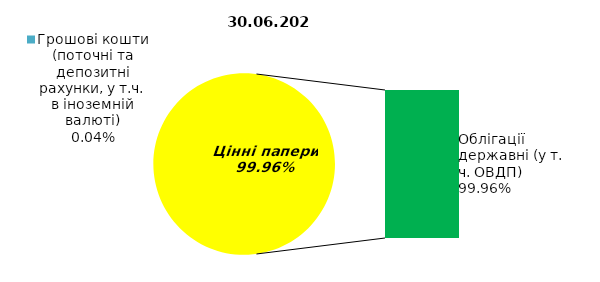
| Category | Series 0 |
|---|---|
| Грошові кошти (поточні та депозитні рахунки, у т.ч. в іноземній валюті) | 0.061 |
| Банківські метали | 0 |
| Нерухомість | 0 |
| Інші активи | 0 |
| Акції | 0 |
| Корпоративні облігації  | 0 |
| Облігації місцевих позик | 0 |
| Облігації державні (у т. ч. ОВДП) | 168.592 |
| Іпотечні сертифікати | 0 |